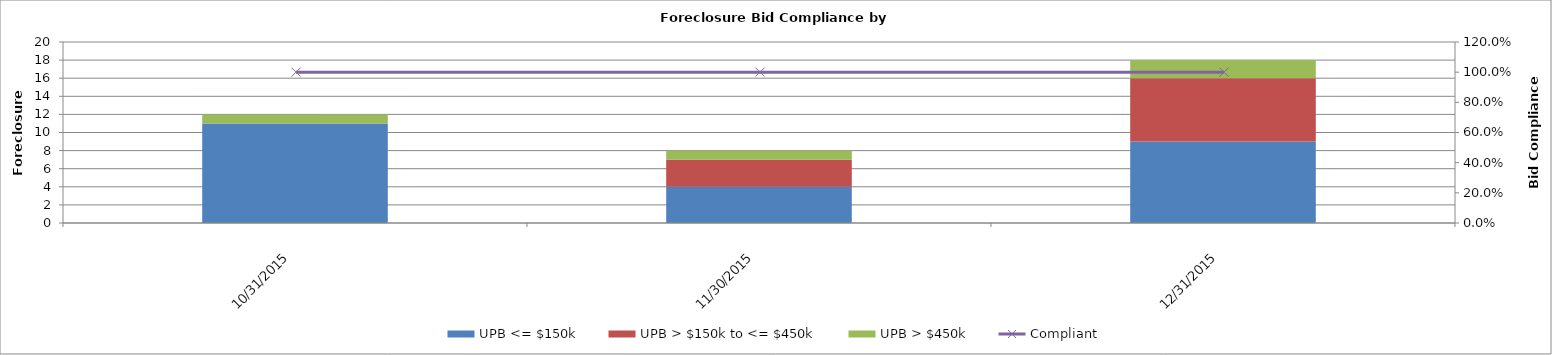
| Category | UPB <= $150k | UPB > $150k to <= $450k | UPB > $450k |
|---|---|---|---|
| 10/31/15 | 11 | 0 | 1 |
| 11/30/15 | 4 | 3 | 1 |
| 12/31/15 | 9 | 7 | 2 |